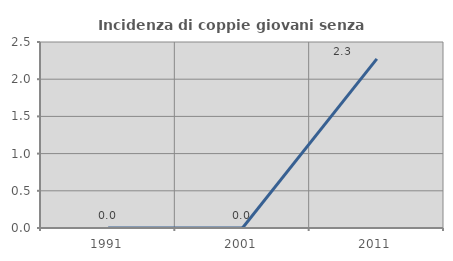
| Category | Incidenza di coppie giovani senza figli |
|---|---|
| 1991.0 | 0 |
| 2001.0 | 0 |
| 2011.0 | 2.273 |